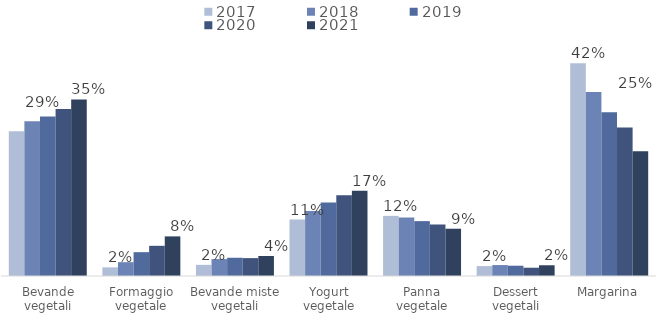
| Category | 2017 | 2018 | 2019 | 2020 | 2021 |
|---|---|---|---|---|---|
| Bevande vegetali | 0.287 | 0.307 | 0.316 | 0.331 | 0.35 |
| Formaggio vegetale | 0.017 | 0.027 | 0.047 | 0.06 | 0.079 |
| Bevande miste vegetali | 0.022 | 0.034 | 0.036 | 0.035 | 0.04 |
| Yogurt vegetale | 0.112 | 0.129 | 0.146 | 0.16 | 0.169 |
| Panna vegetale | 0.119 | 0.116 | 0.109 | 0.102 | 0.094 |
| Dessert vegetali | 0.02 | 0.022 | 0.02 | 0.016 | 0.021 |
| Margarina | 0.422 | 0.365 | 0.324 | 0.294 | 0.247 |